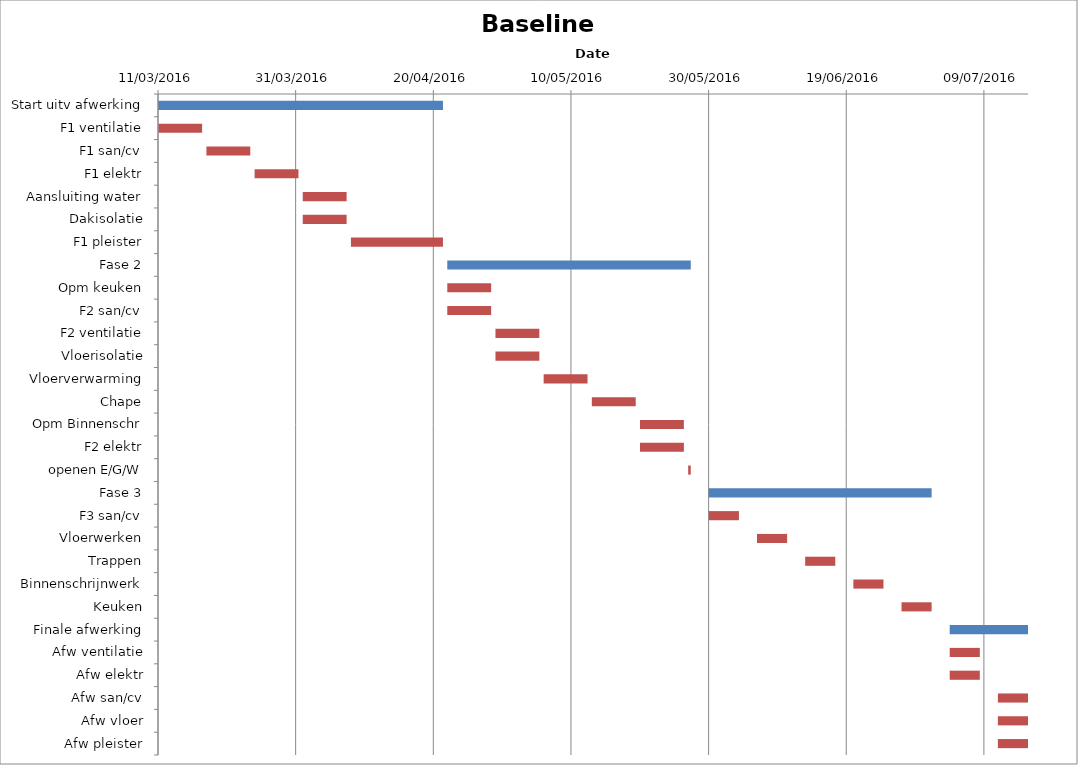
| Category | Baseline start | Actual duration |
|---|---|---|
| Start uitv afwerking | 42440.333 | 41.375 |
| F1 ventilatie | 42440.333 | 6.375 |
| F1 san/cv | 42447.333 | 6.375 |
| F1 elektr | 42454.333 | 6.375 |
| Aansluiting water | 42461.333 | 6.375 |
| Dakisolatie | 42461.333 | 6.375 |
| F1 pleister | 42468.333 | 13.375 |
| Fase 2 | 42482.333 | 35.375 |
| Opm keuken | 42482.333 | 6.375 |
| F2 san/cv | 42482.333 | 6.375 |
| F2 ventilatie | 42489.333 | 6.375 |
| Vloerisolatie | 42489.333 | 6.375 |
| Vloerverwarming | 42496.333 | 6.375 |
| Chape | 42503.333 | 6.375 |
| Opm Binnenschr | 42510.333 | 6.375 |
| F2 elektr | 42510.333 | 6.375 |
| openen E/G/W | 42517.333 | 0.375 |
| Fase 3 | 42520.333 | 32.375 |
| F3 san/cv | 42520.333 | 4.375 |
| Vloerwerken | 42527.333 | 4.375 |
| Trappen | 42534.333 | 4.375 |
| Binnenschrijnwerk | 42541.333 | 4.375 |
| Keuken | 42548.333 | 4.375 |
| Finale afwerking | 42555.333 | 11.375 |
| Afw ventilatie | 42555.333 | 4.375 |
| Afw elektr | 42555.333 | 4.375 |
| Afw san/cv | 42562.333 | 4.375 |
| Afw vloer | 42562.333 | 4.375 |
| Afw pleister | 42562.333 | 4.375 |